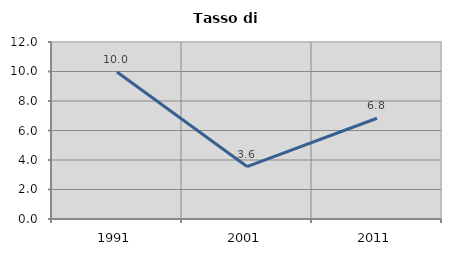
| Category | Tasso di disoccupazione   |
|---|---|
| 1991.0 | 9.972 |
| 2001.0 | 3.555 |
| 2011.0 | 6.829 |